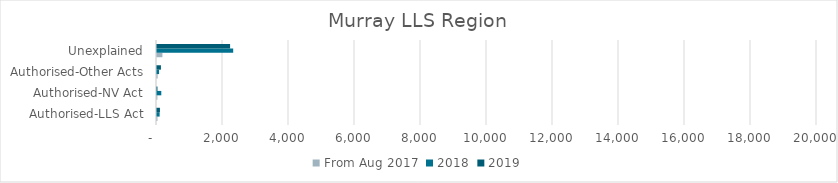
| Category | From Aug 2017 | 2018 | 2019 |
|---|---|---|---|
| Authorised-LLS Act | 14 | 80 | 89 |
| Authorised-NV Act | 12 | 130 | 14 |
| Authorised-Other Acts | 20 | 63 | 119 |
| Unexplained | 164 | 2309 | 2215 |